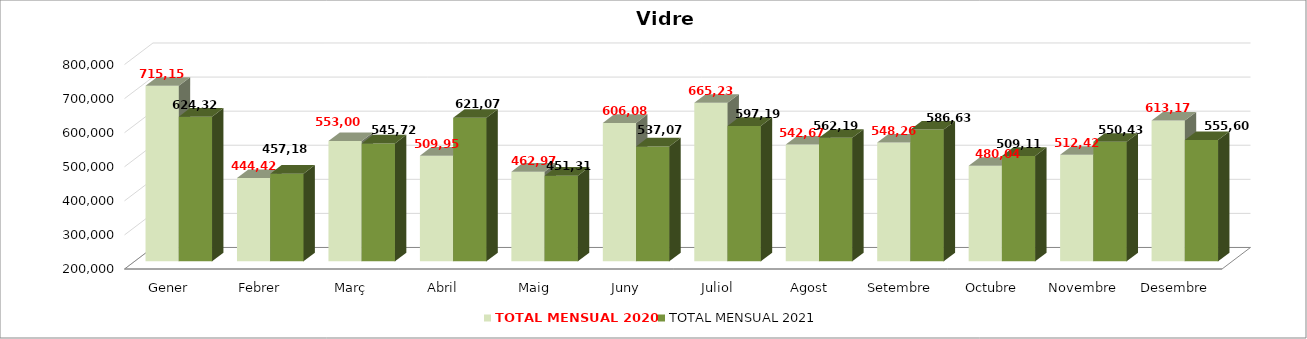
| Category | TOTAL MENSUAL 2020 | TOTAL MENSUAL 2021 |
|---|---|---|
| Gener | 715158.38 | 624320.57 |
| Febrer | 444419.86 | 457183.09 |
| Març | 553002.99 | 545729.31 |
| Abril | 509959.12 | 621077.87 |
| Maig | 462970.54 | 451311.6 |
| Juny | 606082.45 | 537072.04 |
| Juliol | 665232.35 | 597192.23 |
| Agost | 542675.2 | 562194.69 |
| Setembre | 548264.06 | 586630 |
| Octubre | 480047.68 | 509111.17 |
| Novembre | 512420.75 | 550437.83 |
| Desembre | 613171.46 | 555604 |